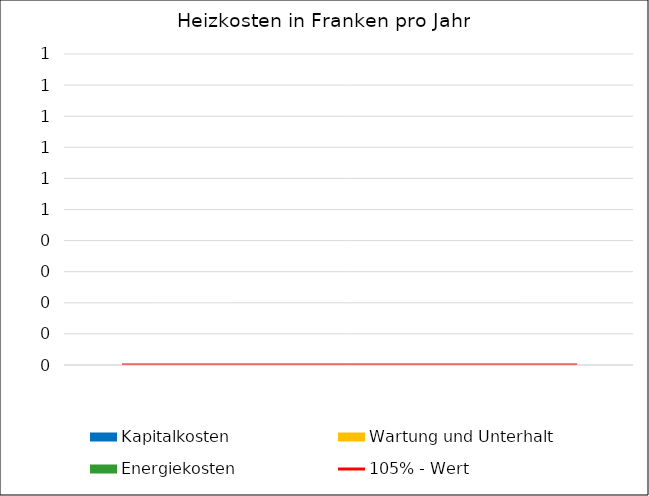
| Category | Kapitalkosten | Wartung und Unterhalt | Energiekosten |
|---|---|---|---|
|   | 0 | 0 | 0 |
|  | 0 | 0 | 0 |
|  | 0 | 0 | 0 |
|   | 0 | 0 | 0 |